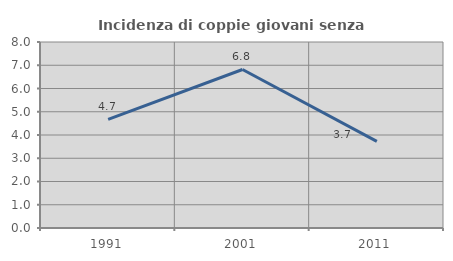
| Category | Incidenza di coppie giovani senza figli |
|---|---|
| 1991.0 | 4.674 |
| 2001.0 | 6.818 |
| 2011.0 | 3.726 |